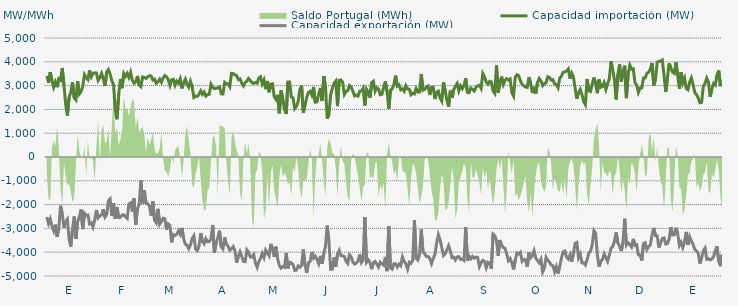
| Category | Capacidad importación (MW) | Capacidad exportación (MW) |
|---|---|---|
| 0 | 3403.125 | -2520 |
| 1900-01-01 | 3114.375 | -2795.625 |
| 1900-01-02 | 3568.125 | -2604.375 |
| 1900-01-03 | 3206.25 | -2913.75 |
| 1900-01-04 | 2931.042 | -3104.125 |
| 1900-01-05 | 3150 | -2842.75 |
| 1900-01-06 | 2933.875 | -3349.75 |
| 1900-01-07 | 3287.292 | -2997.25 |
| 1900-01-08 | 3230.625 | -2043.75 |
| 1900-01-09 | 3740.417 | -2390.833 |
| 1900-01-10 | 3032.708 | -2969.125 |
| 1900-01-11 | 2212.5 | -2711.25 |
| 1900-01-12 | 1744.583 | -2608.958 |
| 1900-01-13 | 2509.583 | -3447.25 |
| 1900-01-14 | 2711.25 | -3765 |
| 1900-01-15 | 3146.25 | -3022.5 |
| 1900-01-16 | 2484.375 | -2501.875 |
| 1900-01-17 | 2400 | -3436.875 |
| 1900-01-18 | 3185.625 | -2718.75 |
| 1900-01-19 | 2647.5 | -2503.125 |
| 1900-01-20 | 2745 | -2206.875 |
| 1900-01-21 | 2960.625 | -3030 |
| 1900-01-22 | 3457.5 | -2362.5 |
| 1900-01-23 | 3331.875 | -2454.375 |
| 1900-01-24 | 3251.25 | -2439.375 |
| 1900-01-25 | 3643.125 | -2812.5 |
| 1900-01-26 | 3367.5 | -2769.375 |
| 1900-01-27 | 3511.875 | -2945.625 |
| 1900-01-28 | 3538.125 | -2640 |
| 1900-01-29 | 3528.75 | -2227.5 |
| 1900-01-30 | 3215.625 | -2556.917 |
| 1900-01-31 | 3330 | -2475 |
| 1900-02-01 | 3511.875 | -2439.375 |
| 1900-02-02 | 3300 | -2195.625 |
| 1900-02-03 | 2985.208 | -2525.625 |
| 1900-02-04 | 3570 | -2416.875 |
| 1900-02-05 | 3673.125 | -1837.5 |
| 1900-02-06 | 3483.75 | -1764.375 |
| 1900-02-07 | 3198.75 | -2480.625 |
| 1900-02-08 | 3052.5 | -1938.75 |
| 1900-02-09 | 1974.375 | -2591.25 |
| 1900-02-10 | 1586.25 | -2103.75 |
| 1900-02-11 | 2604.375 | -2542.5 |
| 1900-02-12 | 3268.125 | -2536.875 |
| 1900-02-13 | 2891.25 | -2441.25 |
| 1900-02-14 | 3510 | -2430.375 |
| 1900-02-15 | 3390 | -2512.5 |
| 1900-02-16 | 3511.875 | -2578.125 |
| 1900-02-17 | 3343.125 | -1972.5 |
| 1900-02-18 | 3558.75 | -1927.5 |
| 1900-02-19 | 3223.125 | -2289.375 |
| 1900-02-20 | 3101.25 | -1732.083 |
| 1900-02-21 | 3165 | -2851.875 |
| 1900-02-22 | 3405 | -2163.75 |
| 1900-02-23 | 3025 | -1996.875 |
| 1900-02-24 | 2958.75 | -985 |
| 1900-02-25 | 3365.625 | -1948.125 |
| 1900-02-26 | 3345 | -1394.375 |
| 1900-02-27 | 3300 | -1944.667 |
| 1900-02-28 | 3373.125 | -1960.375 |
| 1900-02-28 | 3412.5 | -2045 |
| 1900-03-01 | 3406.875 | -2470.625 |
| 1900-03-02 | 3238.125 | -1861.875 |
| 1900-03-03 | 3271.875 | -2651.25 |
| 1900-03-04 | 3097.5 | -2765.625 |
| 1900-03-05 | 3156.75 | -2177.375 |
| 1900-03-06 | 3271.875 | -2821.875 |
| 1900-03-07 | 3142.5 | -2711.25 |
| 1900-03-08 | 3320.625 | -2572.5 |
| 1900-03-09 | 3423.75 | -2593.75 |
| 1900-03-10 | 3369.375 | -3054.375 |
| 1900-03-11 | 3255 | -2812.5 |
| 1900-03-12 | 3003.75 | -2874.375 |
| 1900-03-13 | 3243.75 | -3588.75 |
| 1900-03-14 | 3260.625 | -3258.75 |
| 1900-03-15 | 3015.625 | -3294.375 |
| 1900-03-16 | 3191.25 | -3247.5 |
| 1900-03-17 | 3106.875 | -3105 |
| 1900-03-18 | 3283.125 | -3245.625 |
| 1900-03-19 | 2878.125 | -2981.25 |
| 1900-03-20 | 3118.125 | -3433.125 |
| 1900-03-21 | 3270 | -3667.5 |
| 1900-03-22 | 3052.5 | -3708.75 |
| 1900-03-23 | 2932.5 | -3853.125 |
| 1900-03-24 | 3183.75 | -3691.875 |
| 1900-03-25 | 2970 | -3425.625 |
| 1900-03-26 | 2502.391 | -3308.478 |
| 1900-03-27 | 2557.5 | -3871.875 |
| 1900-03-28 | 2544.375 | -3935.625 |
| 1900-03-29 | 2636.25 | -3740.625 |
| 1900-03-30 | 2778.75 | -3196.875 |
| 1900-03-31 | 2628.75 | -3541.875 |
| 1900-04-01 | 2728.125 | -3646.667 |
| 1900-04-02 | 2557.5 | -3436.875 |
| 1900-04-03 | 2619.375 | -3562.5 |
| 1900-04-04 | 2636.25 | -3549.375 |
| 1900-04-05 | 3056.25 | -3453.75 |
| 1900-04-06 | 2925 | -2854.5 |
| 1900-04-07 | 2874.375 | -4029.375 |
| 1900-04-08 | 2876.25 | -3616.875 |
| 1900-04-09 | 2900.625 | -3388.125 |
| 1900-04-10 | 2941.875 | -3097.5 |
| 1900-04-11 | 2653.125 | -3780 |
| 1900-04-12 | 2647.5 | -3864.375 |
| 1900-04-13 | 3133.125 | -3371.25 |
| 1900-04-14 | 3069.375 | -3673.125 |
| 1900-04-15 | 3082.5 | -3740.625 |
| 1900-04-16 | 2958.75 | -3920.625 |
| 1900-04-17 | 3513.75 | -3864.375 |
| 1900-04-18 | 3506.25 | -3763.125 |
| 1900-04-19 | 3446.25 | -3937.5 |
| 1900-04-20 | 3425.625 | -4440 |
| 1900-04-21 | 3253.125 | -4179.375 |
| 1900-04-22 | 3285 | -3980.417 |
| 1900-04-23 | 3105 | -4185 |
| 1900-04-24 | 2985 | -4387.5 |
| 1900-04-25 | 3123.75 | -4398.75 |
| 1900-04-26 | 3189.375 | -3905.625 |
| 1900-04-27 | 3298.125 | -4003.125 |
| 1900-04-28 | 3215.625 | -4200 |
| 1900-04-29 | 3121.875 | -4207.5 |
| 1900-04-30 | 3090 | -4100.625 |
| 1900-05-01 | 3133.125 | -4455 |
| 1900-05-02 | 3101.25 | -4636.875 |
| 1900-05-03 | 3324.375 | -4408.125 |
| 1900-05-04 | 3371.25 | -4248.75 |
| 1900-05-05 | 3075 | -4050 |
| 1900-05-06 | 3240 | -4228.125 |
| 1900-05-07 | 2850 | -3910 |
| 1900-05-08 | 3191.25 | -4035 |
| 1900-05-09 | 2720.625 | -4149.375 |
| 1900-05-10 | 3065.625 | -3648.75 |
| 1900-05-11 | 3075 | -3862.5 |
| 1900-05-12 | 2529.375 | -4198.125 |
| 1900-05-13 | 2418.75 | -3766.875 |
| 1900-05-14 | 2611.875 | -4272.292 |
| 1900-05-15 | 1836.25 | -4563.75 |
| 1900-05-16 | 2797.5 | -4674.375 |
| 1900-05-17 | 2448.75 | -4601.25 |
| 1900-05-18 | 2016.917 | -4637.083 |
| 1900-05-19 | 1812.292 | -4032.083 |
| 1900-05-20 | 3151.875 | -4680 |
| 1900-05-21 | 3150 | -4422.708 |
| 1900-05-22 | 2521.875 | -4441.875 |
| 1900-05-23 | 2488.333 | -4522.5 |
| 1900-05-24 | 2032.708 | -4766.25 |
| 1900-05-25 | 2126.25 | -4753.125 |
| 1900-05-26 | 2332.5 | -4578.75 |
| 1900-05-27 | 2836.875 | -4636.875 |
| 1900-05-28 | 2998.125 | -4548.75 |
| 1900-05-29 | 1860 | -3875.625 |
| 1900-05-30 | 2173.125 | -4548.75 |
| 1900-05-31 | 2501.25 | -4869.375 |
| 1900-06-01 | 2709.375 | -4443.75 |
| 1900-06-02 | 2754.375 | -4389.375 |
| 1900-06-03 | 2602.5 | -3988.125 |
| 1900-06-04 | 2943.75 | -4250.625 |
| 1900-06-05 | 2304.917 | -4167.5 |
| 1900-06-06 | 2317.5 | -4303.125 |
| 1900-06-07 | 2636.25 | -4481.25 |
| 1900-06-08 | 2900.625 | -4155 |
| 1900-06-09 | 2354.375 | -4488.75 |
| 1900-06-10 | 3395.625 | -4059.375 |
| 1900-06-11 | 2919.375 | -3729.375 |
| 1900-06-12 | 1612.5 | -2879.583 |
| 1900-06-13 | 1777.708 | -3564.375 |
| 1900-06-14 | 2624.875 | -4719.375 |
| 1900-06-15 | 2883.75 | -4711.875 |
| 1900-06-16 | 3101.25 | -4216.875 |
| 1900-06-17 | 3193.125 | -4616.25 |
| 1900-06-18 | 2137.5 | -4083.75 |
| 1900-06-19 | 3221.25 | -3922.5 |
| 1900-06-20 | 3238.125 | -4143.75 |
| 1900-06-21 | 3146.25 | -4149.375 |
| 1900-06-22 | 2629.583 | -4181.25 |
| 1900-06-23 | 2756.25 | -4383.75 |
| 1900-06-24 | 2791.875 | -4475.625 |
| 1900-06-25 | 3005.625 | -4110 |
| 1900-06-26 | 2943.75 | -4190.625 |
| 1900-06-27 | 2761.875 | -4417.5 |
| 1900-06-28 | 2566.875 | -4494.375 |
| 1900-06-29 | 2602.5 | -4453.125 |
| 1900-06-30 | 2561.25 | -4380 |
| 1900-07-01 | 2763.75 | -4098.75 |
| 1900-07-02 | 2769.375 | -4436.25 |
| 1900-07-03 | 2887.5 | -4333.125 |
| 1900-07-04 | 2159.625 | -2520.833 |
| 1900-07-05 | 2846.25 | -4423.125 |
| 1900-07-06 | 2730 | -4323.75 |
| 1900-07-07 | 2491.875 | -4438.125 |
| 1900-07-08 | 3123.75 | -4711.875 |
| 1900-07-09 | 3183.75 | -4440 |
| 1900-07-10 | 2761.875 | -4387.5 |
| 1900-07-11 | 2908.125 | -4496.25 |
| 1900-07-12 | 2861.25 | -4627.5 |
| 1900-07-13 | 2615.625 | -4421.25 |
| 1900-07-14 | 2636.25 | -4479.375 |
| 1900-07-15 | 2925 | -4541.25 |
| 1900-07-16 | 3172.917 | -4194.583 |
| 1900-07-17 | 2752.5 | -4794.375 |
| 1900-07-18 | 2024.208 | -2912.083 |
| 1900-07-19 | 2810.625 | -4661.25 |
| 1900-07-20 | 2859.375 | -4710 |
| 1900-07-21 | 3043.125 | -4486.875 |
| 1900-07-22 | 3418.125 | -4485 |
| 1900-07-23 | 2977.5 | -4623.75 |
| 1900-07-24 | 3028.125 | -4498.125 |
| 1900-07-25 | 2820 | -4565.625 |
| 1900-07-26 | 2863.125 | -4200 |
| 1900-07-27 | 2761.875 | -4381.875 |
| 1900-07-28 | 2994.375 | -4500 |
| 1900-07-29 | 2857.5 | -4715.625 |
| 1900-07-30 | 2850 | -4423.125 |
| 1900-07-31 | 2617.5 | -4466.25 |
| 1900-08-01 | 2681.25 | -4346.25 |
| 1900-08-02 | 2650 | -2650 |
| 1900-08-03 | 2876.25 | -4267.5 |
| 1900-08-04 | 2733.333 | -4333.125 |
| 1900-08-05 | 2735.625 | -4098.75 |
| 1900-08-06 | 3479.167 | -3041.667 |
| 1900-08-07 | 2805 | -3984.375 |
| 1900-08-08 | 2846.25 | -4065 |
| 1900-08-09 | 2941.875 | -4177.5 |
| 1900-08-10 | 2985 | -4183.125 |
| 1900-08-11 | 2606.25 | -4265.625 |
| 1900-08-12 | 2921.25 | -4481.25 |
| 1900-08-13 | 2938.125 | -4273.125 |
| 1900-08-14 | 2435 | -4091.25 |
| 1900-08-15 | 2716.875 | -3618.75 |
| 1900-08-16 | 2767.5 | -3264.375 |
| 1900-08-17 | 2476.875 | -3474.375 |
| 1900-08-18 | 2349.375 | -3798.75 |
| 1900-08-19 | 3142.5 | -4141.875 |
| 1900-08-20 | 2773.125 | -4066.875 |
| 1900-08-21 | 2390.625 | -3896.25 |
| 1900-08-22 | 2113.125 | -3723.75 |
| 1900-08-23 | 2786.25 | -3954.375 |
| 1900-08-24 | 2480.625 | -4226.25 |
| 1900-08-25 | 2829.375 | -4203.75 |
| 1900-08-26 | 2973.75 | -4323.75 |
| 1900-08-27 | 3090 | -4200 |
| 1900-08-28 | 2778.75 | -4186.875 |
| 1900-08-29 | 2986.875 | -4305 |
| 1900-08-30 | 2868.75 | -4282.5 |
| 1900-08-31 | 3000 | -4340.625 |
| 1900-09-01 | 3307.5 | -2947.5 |
| 1900-09-02 | 2713.125 | -4359.375 |
| 1900-09-03 | 2701.875 | -4158.75 |
| 1900-09-04 | 2896.875 | -4276.875 |
| 1900-09-05 | 2842.5 | -4177.5 |
| 1900-09-06 | 2773.125 | -4254.375 |
| 1900-09-07 | 2930.625 | -4201.875 |
| 1900-09-08 | 2990.625 | -4224.375 |
| 1900-09-09 | 3015 | -4603.125 |
| 1900-09-10 | 2883.75 | -4436.25 |
| 1900-09-11 | 3506.25 | -4342.5 |
| 1900-09-12 | 3367.5 | -4393.125 |
| 1900-09-13 | 3144.375 | -4653.75 |
| 1900-09-14 | 3063.75 | -4419.375 |
| 1900-09-15 | 3178.125 | -4456.875 |
| 1900-09-16 | 3153.75 | -4695 |
| 1900-09-17 | 2768.542 | -3240.125 |
| 1900-09-18 | 2672.083 | -3304.625 |
| 1900-09-19 | 3855 | -3498.75 |
| 1900-09-20 | 2703.125 | -4151.25 |
| 1900-09-21 | 3123.333 | -3495.125 |
| 1900-09-22 | 3376.875 | -3697.5 |
| 1900-09-23 | 3048.75 | -3805.875 |
| 1900-09-24 | 3225 | -3836.25 |
| 1900-09-25 | 3286.875 | -4085.625 |
| 1900-09-26 | 3230.625 | -4353.75 |
| 1900-09-27 | 3279.375 | -4267.5 |
| 1900-09-28 | 2704.917 | -4449.375 |
| 1900-09-29 | 2563.833 | -4725 |
| 1900-09-30 | 3360 | -4325.625 |
| 1900-10-01 | 3457.5 | -4035 |
| 1900-10-02 | 3420 | -4078.125 |
| 1900-10-03 | 3202.5 | -4005 |
| 1900-10-04 | 3050.625 | -4383.75 |
| 1900-10-05 | 2992.5 | -4301.25 |
| 1900-10-06 | 2938.125 | -4320 |
| 1900-10-07 | 2928.75 | -4614.375 |
| 1900-10-08 | 3356.25 | -4010.625 |
| 1900-10-09 | 3093.75 | -4231.875 |
| 1900-10-10 | 2686.875 | -4143.75 |
| 1900-10-11 | 2947.5 | -3935.625 |
| 1900-10-12 | 2664.375 | -4254.375 |
| 1900-10-13 | 3127.5 | -4350 |
| 1900-10-14 | 3300 | -4443.75 |
| 1900-10-15 | 3198.542 | -4296 |
| 1900-10-16 | 3001.875 | -4828.125 |
| 1900-10-17 | 3088.125 | -4666.875 |
| 1900-10-18 | 3110.625 | -4215 |
| 1900-10-19 | 3373.125 | -4336.875 |
| 1900-10-20 | 3345 | -4417.5 |
| 1900-10-21 | 3226.875 | -4541.25 |
| 1900-10-22 | 3251.25 | -4569.375 |
| 1900-10-23 | 3069.375 | -4816.875 |
| 1900-10-24 | 3046.875 | -4610.625 |
| 1900-10-25 | 2910 | -4897.5 |
| 1900-10-26 | 3309.375 | -4593.75 |
| 1900-10-27 | 3399.792 | -4243 |
| 1900-10-28 | 3556.875 | -3988.125 |
| 1900-10-29 | 3585.6 | -3948.08 |
| 1900-10-30 | 3605.625 | -4208.542 |
| 1900-10-31 | 3697.5 | -4290 |
| 1900-11-01 | 3291.25 | -4115.625 |
| 1900-11-02 | 3523.125 | -4398.75 |
| 1900-11-03 | 3371.25 | -4055.625 |
| 1900-11-04 | 2883.75 | -3628.125 |
| 1900-11-05 | 2445 | -3590.625 |
| 1900-11-06 | 2711.25 | -4233.75 |
| 1900-11-07 | 2842.292 | -4080 |
| 1900-11-08 | 2631.042 | -4443.75 |
| 1900-11-09 | 2333.542 | -4443.75 |
| 1900-11-10 | 2201.25 | -4537.5 |
| 1900-11-11 | 3275.625 | -4314.375 |
| 1900-11-12 | 2778.75 | -4038.75 |
| 1900-11-13 | 2749.167 | -3955 |
| 1900-11-14 | 3064.375 | -3696.875 |
| 1900-11-15 | 3341.083 | -3091.583 |
| 1900-11-16 | 3070.042 | -3200 |
| 1900-11-17 | 2678.625 | -4117.917 |
| 1900-11-18 | 3264.375 | -4610.625 |
| 1900-11-19 | 2928.75 | -4363.125 |
| 1900-11-20 | 2966.25 | -4316.25 |
| 1900-11-21 | 3121.875 | -4074.375 |
| 1900-11-22 | 2836.875 | -4230 |
| 1900-11-23 | 3078.75 | -4385.625 |
| 1900-11-24 | 3281.25 | -4121.25 |
| 1900-11-25 | 4027.5 | -3836.25 |
| 1900-11-26 | 3646.875 | -3765 |
| 1900-11-27 | 3256.875 | -3536.25 |
| 1900-11-28 | 2419.833 | -3170.625 |
| 1900-11-29 | 3472.5 | -3611.25 |
| 1900-11-30 | 3890.625 | -3742.5 |
| 1900-12-01 | 3166.875 | -3954.375 |
| 1900-12-02 | 3577.5 | -3583.125 |
| 1900-12-03 | 3836 | -2595.625 |
| 1900-12-04 | 2475 | -3700 |
| 1900-12-05 | 3466.875 | -3605.625 |
| 1900-12-06 | 3856.875 | -3676.458 |
| 1900-12-07 | 3697.5 | -3778.125 |
| 1900-12-08 | 3708.75 | -3440.625 |
| 1900-12-09 | 3125.625 | -3712.5 |
| 1900-12-10 | 3026.792 | -3685.625 |
| 1900-12-11 | 2711.458 | -4111.875 |
| 1900-12-12 | 2894.583 | -4117.5 |
| 1900-12-13 | 2908.583 | -4353.75 |
| 1900-12-14 | 3321.875 | -3639.375 |
| 1900-12-15 | 3324.375 | -3603.75 |
| 1900-12-16 | 3515.833 | -3886.875 |
| 1900-12-17 | 3562.5 | -3763.125 |
| 1900-12-18 | 3684.792 | -3688.125 |
| 1900-12-19 | 3950.625 | -3281.25 |
| 1900-12-20 | 3006.042 | -2979.375 |
| 1900-12-21 | 3276.667 | -3305.625 |
| 1900-12-22 | 3978.75 | -3315 |
| 1900-12-23 | 4018.125 | -3806.25 |
| 1900-12-24 | 4020 | -3611.25 |
| 1900-12-25 | 4072.5 | -3421.458 |
| 1900-12-26 | 3435 | -3400.208 |
| 1900-12-27 | 2733.458 | -3658.125 |
| 1900-12-28 | 3328.542 | -3637.5 |
| 1900-12-29 | 3937.5 | -3451.875 |
| 1900-12-30 | 3746.25 | -2948.958 |
| 1900-12-31 | 3564.375 | -3273.75 |
| 1901-01-01 | 3513.75 | -3266.25 |
| 1901-01-02 | 3975 | -2973.75 |
| 1901-01-03 | 3418.125 | -3228.75 |
| 1901-01-04 | 2868.75 | -3712.5 |
| 1901-01-05 | 3568.125 | -3577.5 |
| 1901-01-06 | 3120 | -3802.5 |
| 1901-01-07 | 3305.625 | -3564.375 |
| 1901-01-08 | 2884.375 | -3145.875 |
| 1901-01-09 | 2826.25 | -3695.625 |
| 1901-01-10 | 3149.792 | -3346.875 |
| 1901-01-11 | 3321.458 | -3540 |
| 1901-01-12 | 3048.75 | -3665.625 |
| 1901-01-13 | 2704.25 | -3881.25 |
| 1901-01-14 | 2627.25 | -3950.625 |
| 1901-01-15 | 2475.708 | -4038.75 |
| 1901-01-16 | 2277.917 | -4477.5 |
| 1901-01-17 | 2300 | -4239.375 |
| 1901-01-18 | 2972.708 | -3928.125 |
| 1901-01-19 | 3093.75 | -3825 |
| 1901-01-20 | 3313.333 | -4297.5 |
| 1901-01-21 | 3141.75 | -4268.125 |
| 1901-01-22 | 2533.125 | -4321.875 |
| 1901-01-23 | 2863.375 | -4282.5 |
| 1901-01-24 | 3088.125 | -4185 |
| 1901-01-25 | 3024.375 | -3931.875 |
| 1901-01-26 | 3459.375 | -3751.875 |
| 1901-01-27 | 3630 | -4380 |
| 1901-01-28 | 3020.625 | -4586.25 |
| 1901-01-29 | 3020.625 | -4091.25 |